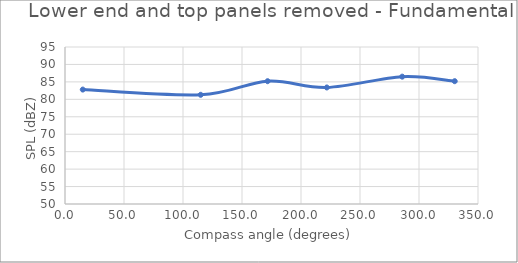
| Category | Series 0 |
|---|---|
| 15.06445125542554 | 82.8 |
| 115.00449447818254 | 81.3 |
| 171.7068171198818 | 85.2 |
| 221.8691292075067 | 83.4 |
| 285.7828166838848 | 86.5 |
| 330.28010595813004 | 85.2 |